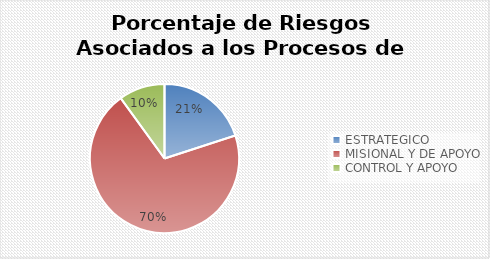
| Category | Series 0 |
|---|---|
| ESTRATEGICO | 6 |
| MISIONAL Y DE APOYO | 21 |
| CONTROL Y APOYO | 3 |